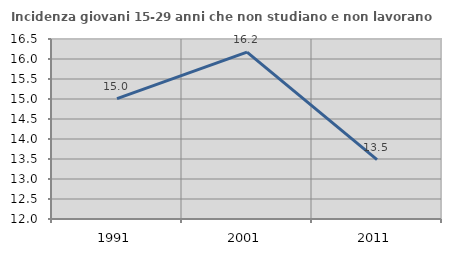
| Category | Incidenza giovani 15-29 anni che non studiano e non lavorano  |
|---|---|
| 1991.0 | 15.008 |
| 2001.0 | 16.17 |
| 2011.0 | 13.483 |